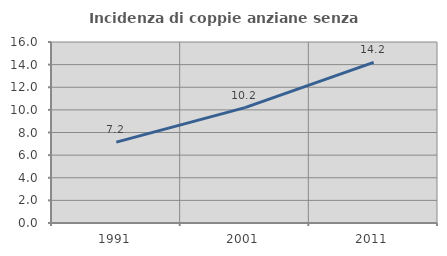
| Category | Incidenza di coppie anziane senza figli  |
|---|---|
| 1991.0 | 7.152 |
| 2001.0 | 10.199 |
| 2011.0 | 14.192 |